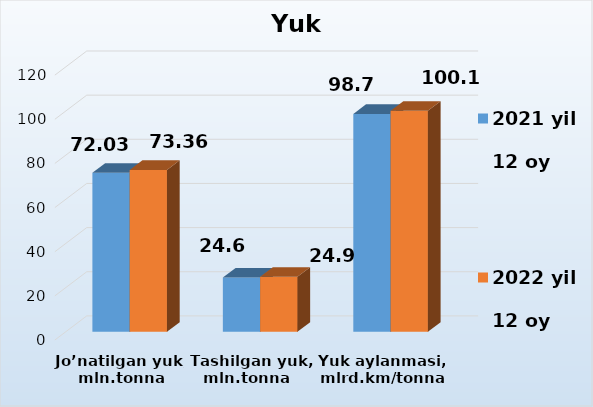
| Category | 2021 yil    
12 oy | 2022 yil    
12 oy |
|---|---|---|
| Jo’natilgan yuk, mln.tonna | 72.03 | 73.36 |
| Tashilgan yuk, mln.tonna   | 24.6 | 24.9 |
| Yuk aylanmasi, mlrd.km/tonnasi | 98.7 | 100.1 |